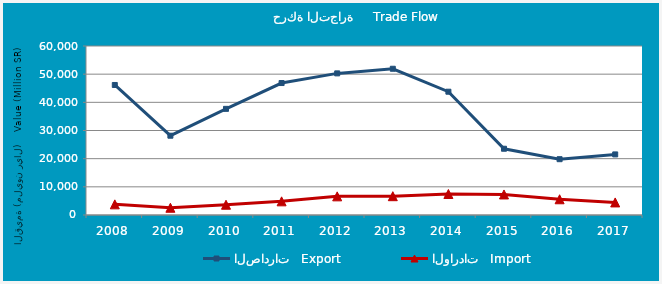
| Category | الصادرات   Export | الواردات   Import |
|---|---|---|
| 2008.0 | 46164915068 | 3777893278 |
| 2009.0 | 28151118424 | 2569669769 |
| 2010.0 | 37685232357 | 3648764367 |
| 2011.0 | 46847798622 | 4853005979 |
| 2012.0 | 50277389034 | 6621533080 |
| 2013.0 | 51920686365 | 6674963457 |
| 2014.0 | 43770672456 | 7459547235 |
| 2015.0 | 23523615780 | 7294214562 |
| 2016.0 | 19813772303 | 5585702683 |
| 2017.0 | 21510939134 | 4464827613 |